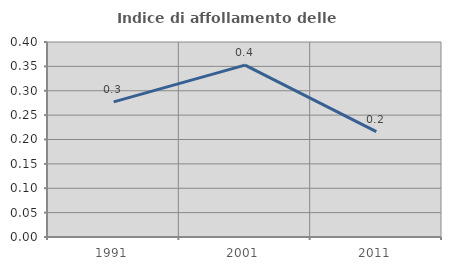
| Category | Indice di affollamento delle abitazioni  |
|---|---|
| 1991.0 | 0.277 |
| 2001.0 | 0.353 |
| 2011.0 | 0.216 |